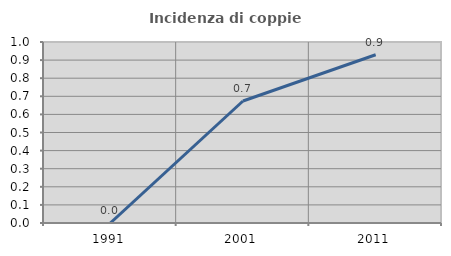
| Category | Incidenza di coppie miste |
|---|---|
| 1991.0 | 0 |
| 2001.0 | 0.674 |
| 2011.0 | 0.929 |